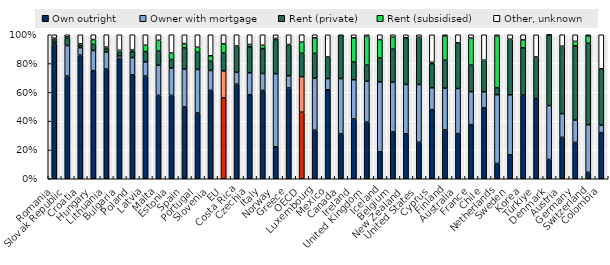
| Category | Own outright  | Owner with mortgage | Rent (private) | Rent (subsidised) | Other, unknown |
|---|---|---|---|---|---|
| Romania | 0.936 | 0.011 | 0.017 | 0.013 | 0.024 |
| Slovak Republic | 0.713 | 0.212 | 0.051 | 0.009 | 0.015 |
| Croatia | 0.858 | 0.052 | 0.014 | 0.012 | 0.063 |
| Hungary | 0.751 | 0.14 | 0.042 | 0.034 | 0.033 |
| Lithuania | 0.762 | 0.119 | 0.02 | 0.013 | 0.086 |
| Bulgaria | 0.835 | 0.018 | 0.024 | 0.015 | 0.108 |
| Poland | 0.721 | 0.12 | 0.042 | 0.01 | 0.107 |
| Latvia | 0.713 | 0.099 | 0.071 | 0.044 | 0.072 |
| Malta | 0.579 | 0.21 | 0.098 | 0.075 | 0.039 |
| Estonia | 0.579 | 0.19 | 0.059 | 0.045 | 0.127 |
| Spain | 0.499 | 0.261 | 0.149 | 0.029 | 0.062 |
| Portugal | 0.457 | 0.302 | 0.12 | 0.034 | 0.087 |
| Slovenia | 0.614 | 0.138 | 0.064 | 0.038 | 0.146 |
| EU | 0.562 | 0.188 | 0.124 | 0.064 | 0.063 |
| Costa Rica | 0.658 | 0.083 | 0.182 | 0 | 0.078 |
| Czechia | 0.584 | 0.152 | 0.181 | 0.016 | 0.067 |
| Italy | 0.614 | 0.117 | 0.173 | 0.024 | 0.073 |
| Norway | 0.222 | 0.508 | 0.234 | 0.011 | 0.025 |
| Greece | 0.63 | 0.085 | 0.213 | 0.004 | 0.067 |
| OECD | 0.462 | 0.247 | 0.162 | 0.078 | 0.051 |
| Luxembourg | 0.337 | 0.361 | 0.172 | 0.108 | 0.021 |
| Mexico | 0.618 | 0.078 | 0.15 | 0 | 0.154 |
| Canada | 0.312 | 0.384 | 0.304 | 0 | 0 |
| Ireland | 0.415 | 0.272 | 0.123 | 0.168 | 0.021 |
| United Kingdom | 0.393 | 0.284 | 0.112 | 0.2 | 0.011 |
| Iceland | 0.187 | 0.486 | 0.167 | 0.127 | 0.034 |
| Belgium | 0.325 | 0.345 | 0.229 | 0.084 | 0.016 |
| New Zealand | 0.312 | 0.343 | 0.324 | 0 | 0.021 |
| United States | 0.253 | 0.401 | 0.329 | 0 | 0.017 |
| Cyprus | 0.48 | 0.151 | 0.168 | 0.009 | 0.191 |
| Finland | 0.339 | 0.29 | 0.194 | 0.168 | 0.009 |
| Australia | 0.314 | 0.313 | 0.317 | 0 | 0.056 |
| France | 0.376 | 0.229 | 0.184 | 0.188 | 0.023 |
| Chile | 0.494 | 0.11 | 0.219 | 0 | 0.177 |
| Netherlands | 0.107 | 0.477 | 0.049 | 0.356 | 0.011 |
| Sweden | 0.166 | 0.416 | 0.386 | 0 | 0.031 |
| Korea | 0.58 | 0 | 0.329 | 0.054 | 0.036 |
| Türkiye | 0.557 | 0 | 0.288 | 0 | 0.154 |
| Denmark | 0.134 | 0.374 | 0.491 | 0 | 0.001 |
| Austria | 0.287 | 0.165 | 0.468 | 0 | 0.079 |
| Germany | 0.253 | 0.155 | 0.516 | 0.03 | 0.046 |
| Switzerland | 0.045 | 0.33 | 0.565 | 0.052 | 0.007 |
| Colombia | 0.321 | 0.051 | 0.392 | 0 | 0.236 |